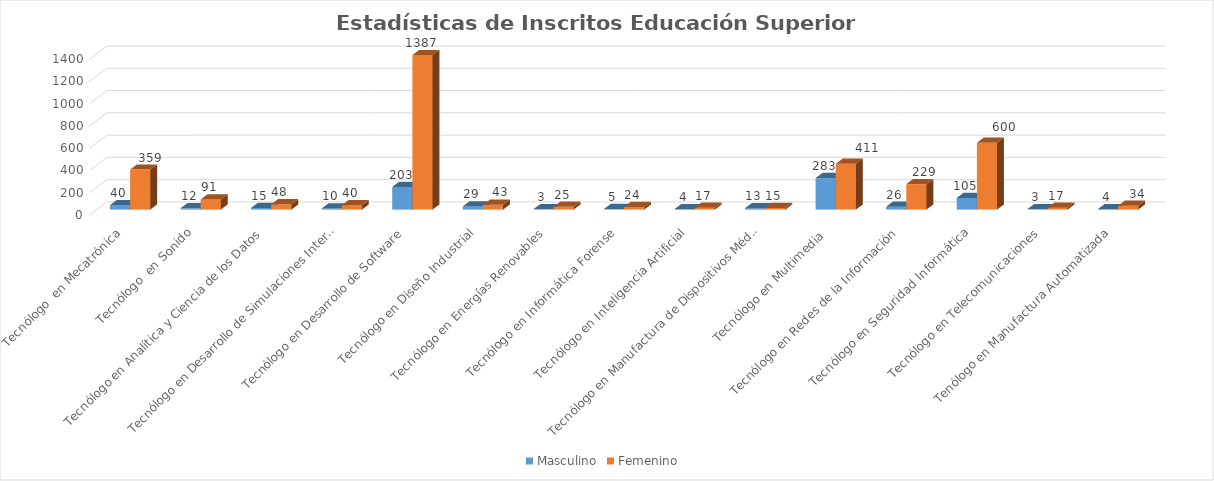
| Category | Masculino | Femenino  |
|---|---|---|
| Tecnólogo  en Mecatrónica | 40 | 359 |
| Tecnólogo  en Sonido | 12 | 91 |
| Tecnólogo en Analítica y Ciencia de los Datos | 15 | 48 |
| Tecnólogo en Desarrollo de Simulaciones Interactivas y Videojuegos | 10 | 40 |
| Tecnólogo en Desarrollo de Software | 203 | 1387 |
| Tecnólogo en Diseño Industrial | 29 | 43 |
| Tecnólogo en Energías Renovables | 3 | 25 |
| Tecnólogo en Informática Forense | 5 | 24 |
| Tecnólogo en Inteligencia Artificial | 4 | 17 |
| Tecnólogo en Manufactura de Dispositivos Médicos  | 13 | 15 |
| Tecnólogo en Multimedia  | 283 | 411 |
| Tecnólogo en Redes de la Información | 26 | 229 |
| Tecnólogo en Seguridad Informática | 105 | 600 |
| Tecnólogo en Telecomunicaciones | 3 | 17 |
| Tenólogo en Manufactura Automatizada | 4 | 34 |